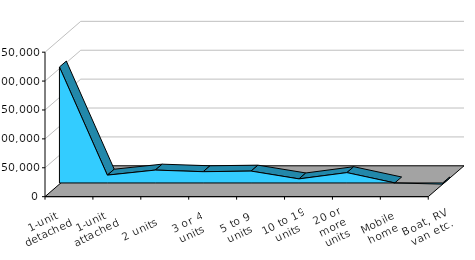
| Category | Monroe |
|---|---|
| 1-unit detached | 202820 |
| 1-unit attached | 15687 |
| 2 units | 24431 |
| 3 or 4 units | 21626 |
| 5 to 9 units | 22697 |
| 10 to 19 units | 9193 |
| 20 or more units | 20046 |
| Mobile home | 2213 |
| Boat, RV, van etc. | 80 |